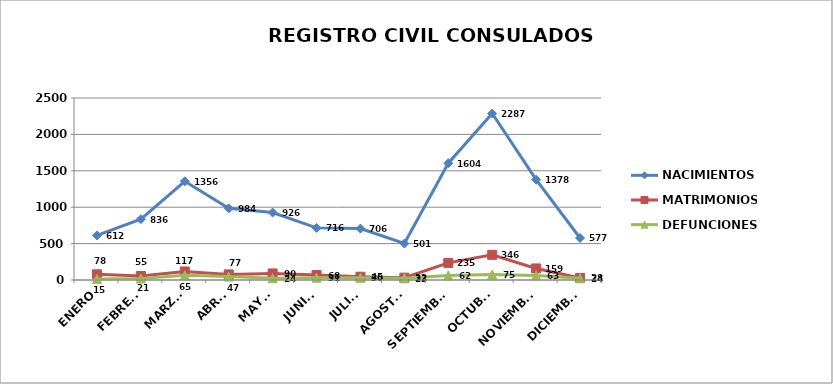
| Category | NACIMIENTOS | MATRIMONIOS | DEFUNCIONES |
|---|---|---|---|
| ENERO | 612 | 78 | 15 |
| FEBRERO | 836 | 55 | 21 |
| MARZO | 1356 | 117 | 65 |
| ABRIL | 984 | 77 | 47 |
| MAYO | 926 | 90 | 24 |
| JUNIO | 716 | 68 | 31 |
| JULIO | 706 | 45 | 30 |
| AGOSTO | 501 | 32 | 23 |
| SEPTIEMBRE | 1604 | 235 | 62 |
| OCTUBRE | 2287 | 346 | 75 |
| NOVIEMBRE | 1378 | 159 | 63 |
| DICIEMBRE | 577 | 28 | 24 |